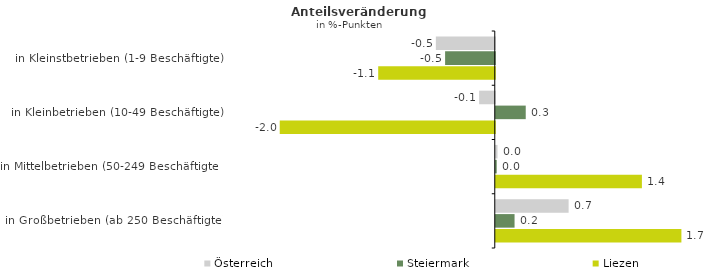
| Category | Österreich | Steiermark | Liezen |
|---|---|---|---|
| in Kleinstbetrieben (1-9 Beschäftigte) | -0.55 | -0.464 | -1.088 |
| in Kleinbetrieben (10-49 Beschäftigte) | -0.146 | 0.28 | -2.008 |
| in Mittelbetrieben (50-249 Beschäftigte) | 0.016 | 0.009 | 1.364 |
| in Großbetrieben (ab 250 Beschäftigte) | 0.68 | 0.175 | 1.733 |